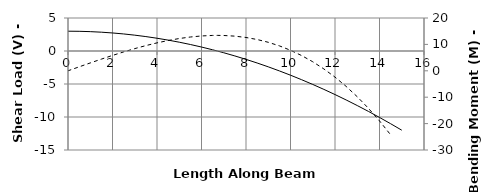
| Category | V |
|---|---|
| 0.0 | 3 |
| 0.0 | 3 |
| 0.0 | 3 |
| 0.5 | 2.983 |
| 1.0 | 2.933 |
| 1.5 | 2.85 |
| 2.0 | 2.733 |
| 2.0 | 2.733 |
| 2.5 | 2.583 |
| 3.0 | 2.4 |
| 3.5 | 2.183 |
| 4.0 | 1.933 |
| 4.5 | 1.65 |
| 5.0 | 1.333 |
| 5.5 | 0.983 |
| 6.0 | 0.6 |
| 6.5 | 0.183 |
| 6.711 | -0.003 |
| 7.0 | -0.267 |
| 7.5 | -0.75 |
| 8.0 | -1.267 |
| 8.5 | -1.817 |
| 9.0 | -2.4 |
| 9.5 | -3.017 |
| 10.0 | -3.667 |
| 10.5 | -4.35 |
| 11.0 | -5.067 |
| 11.5 | -5.817 |
| 12.0 | -6.6 |
| 12.5 | -7.417 |
| 13.0 | -8.267 |
| 13.5 | -9.15 |
| 14.0 | -10.067 |
| 14.5 | -11.017 |
| 15.0 | -12 |